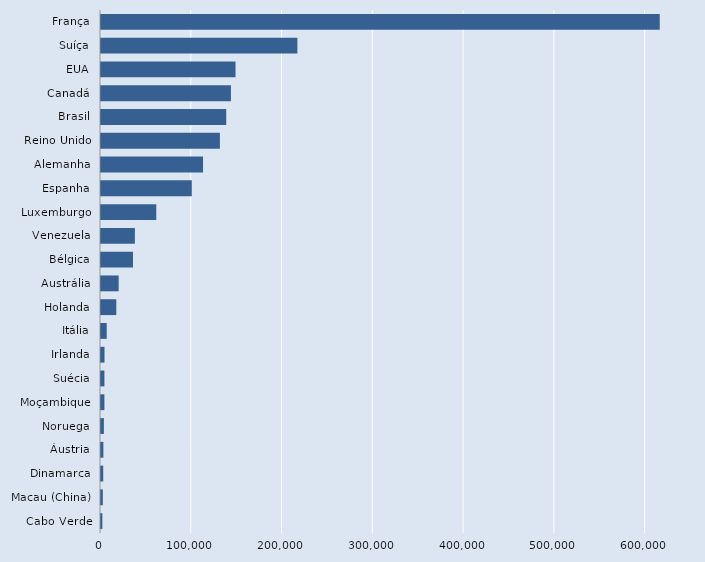
| Category | Series 0 |
|---|---|
| Cabo Verde | 1491 |
| Macau (China) | 2011 |
| Dinamarca | 2457 |
| Áustria | 2615 |
| Noruega | 3166 |
| Moçambique | 3767 |
| Suécia | 3775 |
| Irlanda | 3866 |
| Itália | 6305 |
| Holanda | 16868 |
| Austrália | 19460 |
| Bélgica | 35249 |
| Venezuela | 37326 |
| Luxemburgo | 60897 |
| Espanha | 100027 |
| Alemanha | 112430 |
| Reino Unido | 131000 |
| Brasil | 137973 |
| Canadá | 143160 |
| EUA | 148208 |
| Suíça | 216378 |
| França | 615573 |